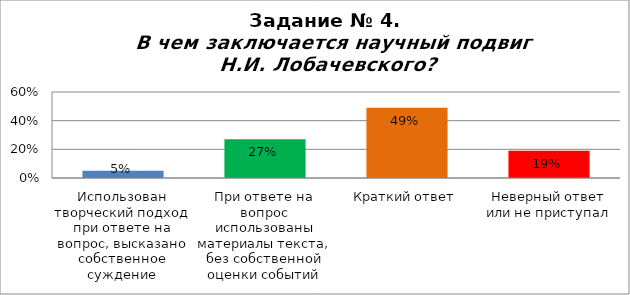
| Category | В чем заключается научный подвиг Н.И. Лобачевского? |
|---|---|
| Использован творческий подход при ответе на вопрос, высказано собственное суждение | 0.05 |
| При ответе на вопрос использованы материалы текста, без собственной оценки событий | 0.27 |
| Краткий ответ | 0.49 |
| Неверный ответ или не приступал | 0.19 |